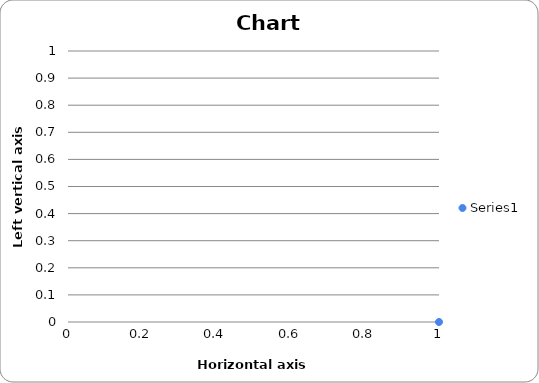
| Category | Series 0 |
|---|---|
| 0 | 0 |
| 1 | 0 |
| 2 | 0 |
| 3 | 0 |
| 4 | 0 |
| 5 | 0 |
| 6 | 0 |
| 7 | 0 |
| 8 | 0 |
| 9 | 0 |
| 10 | 0 |
| 11 | 0 |
| 12 | 0 |
| 13 | 0 |
| 14 | 0 |
| 15 | 0 |
| 16 | 0 |
| 17 | 0 |
| 18 | 0 |
| 19 | 0 |
| 20 | 0 |
| 21 | 0 |
| 22 | 0 |
| 23 | 0 |
| 24 | 0 |
| 25 | 0 |
| 26 | 0 |
| 27 | 0 |
| 28 | 0 |
| 29 | 0 |
| 30 | 0 |
| 31 | 0 |
| 32 | 0 |
| 33 | 0 |
| 34 | 0 |
| 35 | 0 |
| 36 | 0 |
| 37 | 0 |
| 38 | 0 |
| 39 | 0 |
| 40 | 0 |
| 41 | 0 |
| 42 | 0 |
| 43 | 0 |
| 44 | 0 |
| 45 | 0 |
| 46 | 0 |
| 47 | 0 |
| 48 | 0 |
| 49 | 0 |
| 50 | 0 |
| 51 | 0 |
| 52 | 0 |
| 53 | 0 |
| 54 | 0 |
| 55 | 0 |
| 56 | 0 |
| 57 | 0 |
| 58 | 0 |
| 59 | 0 |
| 60 | 0 |
| 61 | 0 |
| 62 | 0 |
| 63 | 0 |
| 64 | 0 |
| 65 | 0 |
| 66 | 0 |
| 67 | 0 |
| 68 | 0 |
| 69 | 0 |
| 70 | 0 |
| 71 | 0 |
| 72 | 0 |
| 73 | 0 |
| 74 | 0 |
| 75 | 0 |
| 76 | 0 |
| 77 | 0 |
| 78 | 0 |
| 79 | 0 |
| 80 | 0 |
| 81 | 0 |
| 82 | 0 |
| 83 | 0 |
| 84 | 0 |
| 85 | 0 |
| 86 | 0 |
| 87 | 0 |
| 88 | 0 |
| 89 | 0 |
| 90 | 0 |
| 91 | 0 |
| 92 | 0 |
| 93 | 0 |
| 94 | 0 |
| 95 | 0 |
| 96 | 0 |
| 97 | 0 |
| 98 | 0 |
| 99 | 0 |
| 100 | 0 |
| 101 | 0 |
| 102 | 0 |
| 103 | 0 |
| 104 | 0 |
| 105 | 0 |
| 106 | 0 |
| 107 | 0 |
| 108 | 0 |
| 109 | 0 |
| 110 | 0 |
| 111 | 0 |
| 112 | 0 |
| 113 | 0 |
| 114 | 0 |
| 115 | 0 |
| 116 | 0 |
| 117 | 0 |
| 118 | 0 |
| 119 | 0 |
| 120 | 0 |
| 121 | 0 |
| 122 | 0 |
| 123 | 0 |
| 124 | 0 |
| 125 | 0 |
| 126 | 0 |
| 127 | 0 |
| 128 | 0 |
| 129 | 0 |
| 130 | 0 |
| 131 | 0 |
| 132 | 0 |
| 133 | 0 |
| 134 | 0 |
| 135 | 0 |
| 136 | 0 |
| 137 | 0 |
| 138 | 0 |
| 139 | 0 |
| 140 | 0 |
| 141 | 0 |
| 142 | 0 |
| 143 | 0 |
| 144 | 0 |
| 145 | 0 |
| 146 | 0 |
| 147 | 0 |
| 148 | 0 |
| 149 | 0 |
| 150 | 0 |
| 151 | 0 |
| 152 | 0 |
| 153 | 0 |
| 154 | 0 |
| 155 | 0 |
| 156 | 0 |
| 157 | 0 |
| 158 | 0 |
| 159 | 0 |
| 160 | 0 |
| 161 | 0 |
| 162 | 0 |
| 163 | 0 |
| 164 | 0 |
| 165 | 0 |
| 166 | 0 |
| 167 | 0 |
| 168 | 0 |
| 169 | 0 |
| 170 | 0 |
| 171 | 0 |
| 172 | 0 |
| 173 | 0 |
| 174 | 0 |
| 175 | 0 |
| 176 | 0 |
| 177 | 0 |
| 178 | 0 |
| 179 | 0 |
| 180 | 0 |
| 181 | 0 |
| 182 | 0 |
| 183 | 0 |
| 184 | 0 |
| 185 | 0 |
| 186 | 0 |
| 187 | 0 |
| 188 | 0 |
| 189 | 0 |
| 190 | 0 |
| 191 | 0 |
| 192 | 0 |
| 193 | 0 |
| 194 | 0 |
| 195 | 0 |
| 196 | 0 |
| 197 | 0 |
| 198 | 0 |
| 199 | 0 |
| 200 | 0 |
| 201 | 0 |
| 202 | 0 |
| 203 | 0 |
| 204 | 0 |
| 205 | 0 |
| 206 | 0 |
| 207 | 0 |
| 208 | 0 |
| 209 | 0 |
| 210 | 0 |
| 211 | 0 |